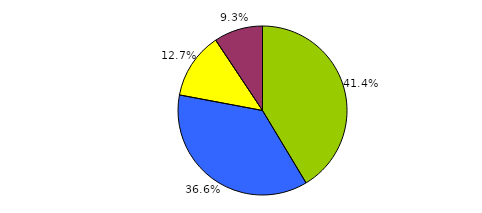
| Category | Series 0 |
|---|---|
| 0 | 456 |
| 1 | 403 |
| 2 | 140 |
| 3 | 103 |